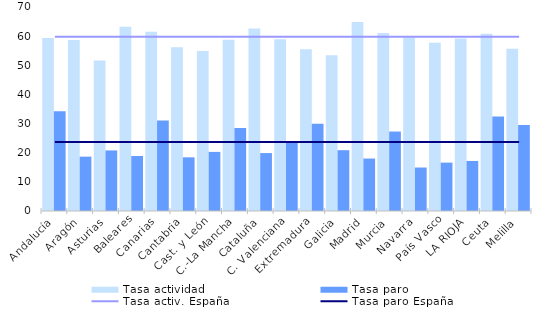
| Category | Tasa actividad | Tasa paro |
|---|---|---|
| Andalucía | 59.35 | 34.23 |
| Aragón | 58.68 | 18.65 |
| Asturias | 51.63 | 20.78 |
| Baleares | 63.23 | 18.88 |
| Canarias | 61.55 | 31.08 |
| Cantabria | 56.16 | 18.42 |
| Cast. y León | 54.91 | 20.28 |
| C.-La Mancha | 58.73 | 28.5 |
| Cataluña | 62.61 | 19.88 |
| C. Valenciana | 58.96 | 23.48 |
| Extremadura | 55.5 | 29.96 |
| Galicia | 53.47 | 20.87 |
| Madrid | 64.82 | 18 |
| Murcia | 61.08 | 27.26 |
| Navarra | 59.55 | 14.92 |
| País Vasco | 57.76 | 16.6 |
| LA RIOJA | 59.19 | 17.17 |
| Ceuta | 60.82 | 32.46 |
| Melilla | 55.65 | 29.52 |